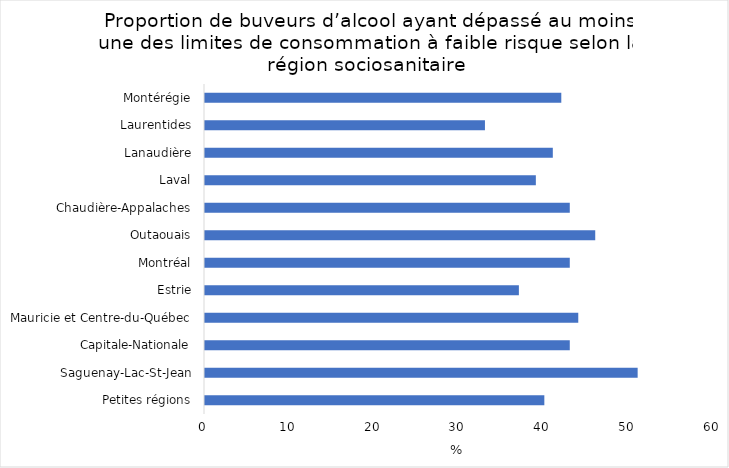
| Category | Series 0 |
|---|---|
| Petites régions | 40 |
| Saguenay-Lac-St-Jean | 51 |
| Capitale-Nationale | 43 |
| Mauricie et Centre-du-Québec | 44 |
| Estrie | 37 |
| Montréal | 43 |
| Outaouais | 46 |
| Chaudière-Appalaches | 43 |
| Laval | 39 |
| Lanaudière | 41 |
| Laurentides | 33 |
| Montérégie | 42 |